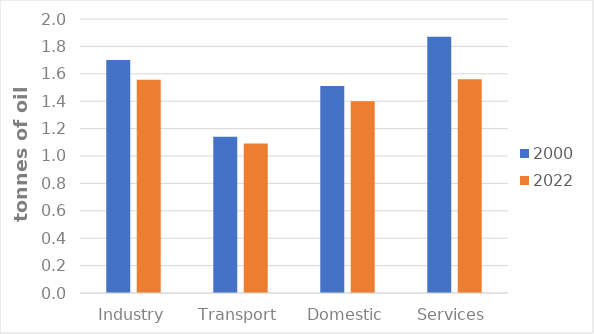
| Category | 2000 | 2022 |
|---|---|---|
| 0 | 1.701 | 1.556 |
| 1 | 1.141 | 1.091 |
| 2 | 1.512 | 1.4 |
| 3 | 1.87 | 1.56 |